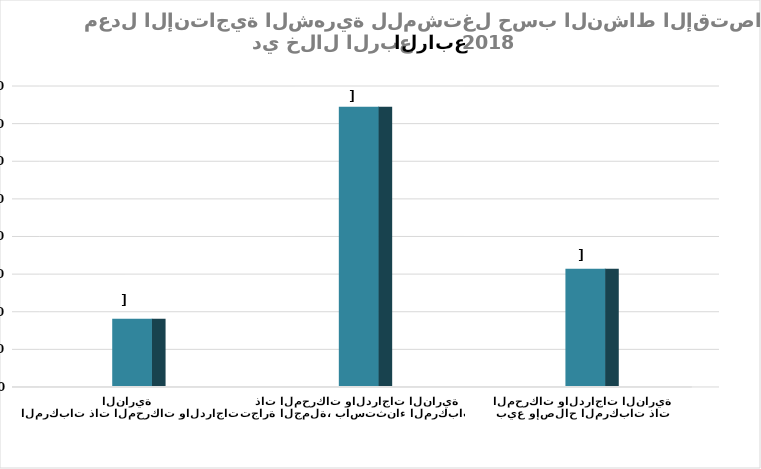
| Category | إنتاجية المشتغل  |
|---|---|
| بيع وإصلاح المركبات ذات المحركات والدراجات النارية | 31181.133 |
| تجارة الجملة، باستثناء المركبات ذات المحركات والدراجات النارية | 74248.281 |
| تجارة التجزئة، باستثناء المركبات ذات المحركات والدراجات النارية | 17860.404 |